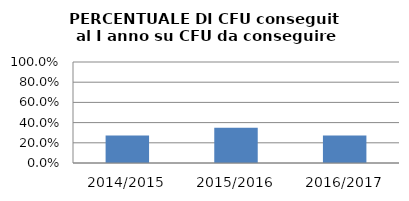
| Category | 2014/2015 2015/2016 2016/2017 |
|---|---|
| 2014/2015 | 0.273 |
| 2015/2016 | 0.348 |
| 2016/2017 | 0.271 |